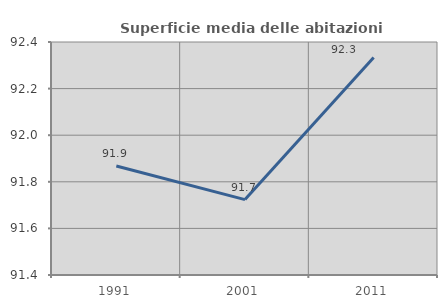
| Category | Superficie media delle abitazioni occupate |
|---|---|
| 1991.0 | 91.868 |
| 2001.0 | 91.724 |
| 2011.0 | 92.334 |